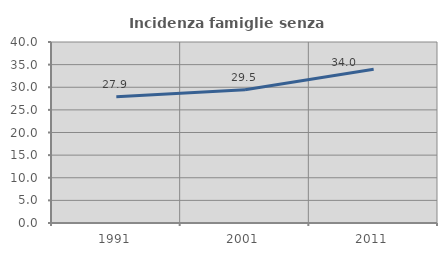
| Category | Incidenza famiglie senza nuclei |
|---|---|
| 1991.0 | 27.912 |
| 2001.0 | 29.458 |
| 2011.0 | 33.999 |